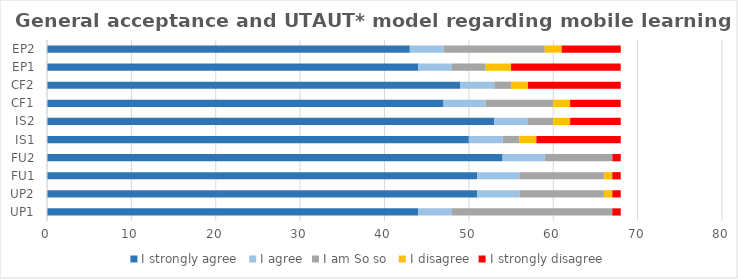
| Category | I strongly agree  | I agree | I am So so  | I disagree | I strongly disagree |
|---|---|---|---|---|---|
| UP1 | 44 | 4 | 19 | 0 | 1 |
| UP2 | 51 | 5 | 10 | 1 | 1 |
| FU1 | 51 | 5 | 10 | 1 | 1 |
| FU2 | 54 | 5 | 8 | 0 | 1 |
| IS1 | 50 | 4 | 2 | 2 | 10 |
| IS2 | 53 | 4 | 3 | 2 | 6 |
| CF1 | 47 | 5 | 8 | 2 | 6 |
| CF2 | 49 | 4 | 2 | 2 | 11 |
| EP1 | 44 | 4 | 4 | 3 | 13 |
| EP2 | 43 | 4 | 12 | 2 | 7 |